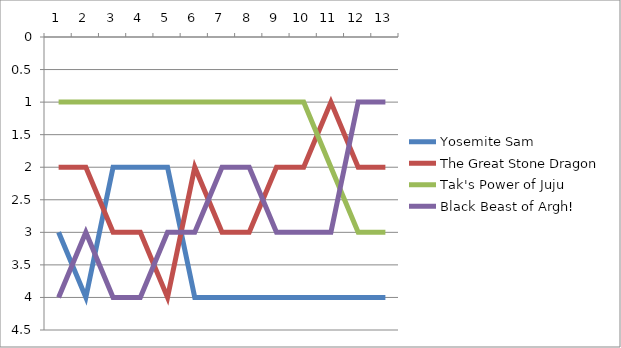
| Category | Yosemite Sam | The Great Stone Dragon | Tak's Power of Juju | Black Beast of Argh! |
|---|---|---|---|---|
| 0 | 3 | 2 | 1 | 4 |
| 1 | 4 | 2 | 1 | 3 |
| 2 | 2 | 3 | 1 | 4 |
| 3 | 2 | 3 | 1 | 4 |
| 4 | 2 | 4 | 1 | 3 |
| 5 | 4 | 2 | 1 | 3 |
| 6 | 4 | 3 | 1 | 2 |
| 7 | 4 | 3 | 1 | 2 |
| 8 | 4 | 2 | 1 | 3 |
| 9 | 4 | 2 | 1 | 3 |
| 10 | 4 | 1 | 2 | 3 |
| 11 | 4 | 2 | 3 | 1 |
| 12 | 4 | 2 | 3 | 1 |